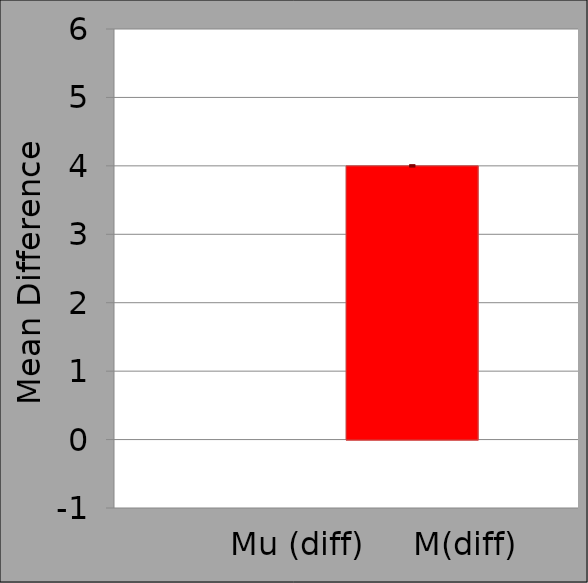
| Category | mu (diff) | M (diff) |
|---|---|---|
|  | 0 | 4 |